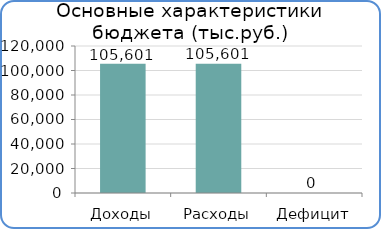
| Category | Итог |
|---|---|
| Доходы | 105600700 |
| Расходы | 105600700 |
| Дефицит | 0 |